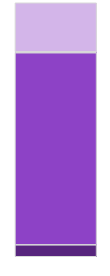
| Category | Series 0 | Series 1 | Series 2 | Series 3 |
|---|---|---|---|---|
| 0 | 4.698 | 75.632 | 0.383 | 19.288 |